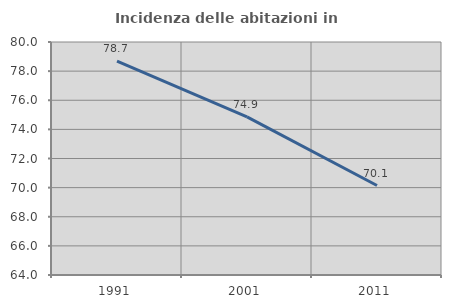
| Category | Incidenza delle abitazioni in proprietà  |
|---|---|
| 1991.0 | 78.679 |
| 2001.0 | 74.859 |
| 2011.0 | 70.144 |